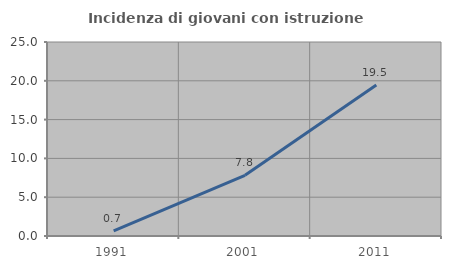
| Category | Incidenza di giovani con istruzione universitaria |
|---|---|
| 1991.0 | 0.667 |
| 2001.0 | 7.817 |
| 2011.0 | 19.469 |